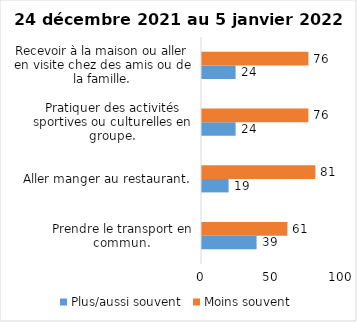
| Category | Plus/aussi souvent | Moins souvent |
|---|---|---|
| Prendre le transport en commun. | 39 | 61 |
| Aller manger au restaurant. | 19 | 81 |
| Pratiquer des activités sportives ou culturelles en groupe. | 24 | 76 |
| Recevoir à la maison ou aller en visite chez des amis ou de la famille. | 24 | 76 |